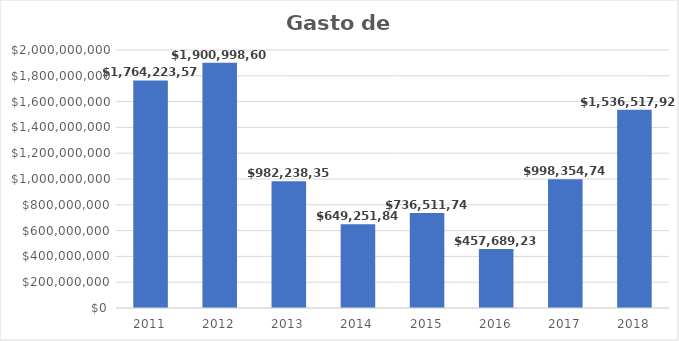
| Category | Series 1 |
|---|---|
| 2011.0 | 1764223575 |
| 2012.0 | 1900998608 |
| 2013.0 | 982238352 |
| 2014.0 | 649251846 |
| 2015.0 | 736511742 |
| 2016.0 | 457689232.77 |
| 2017.0 | 998354740.86 |
| 2018.0 | 1536517929 |